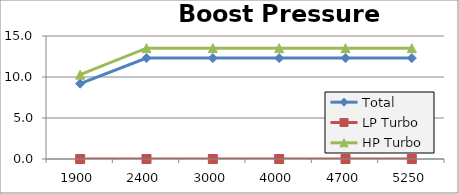
| Category | Total | LP Turbo | HP Turbo |
|---|---|---|---|
| 1900.0 | 9.183 | 0 | 10.283 |
| 2400.0 | 12.305 | 0 | 13.515 |
| 3000.0 | 12.305 | 0 | 13.515 |
| 4000.0 | 12.305 | 0 | 13.515 |
| 4700.0 | 12.305 | 0 | 13.515 |
| 5250.0 | 12.305 | 0 | 13.515 |